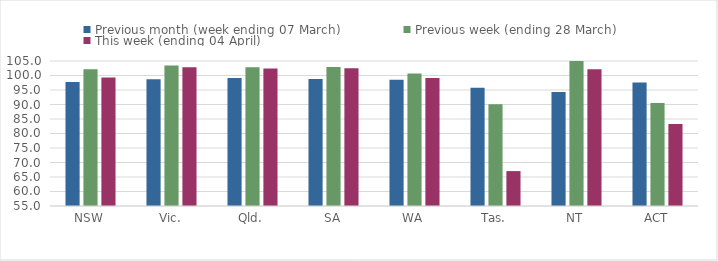
| Category | Previous month (week ending 07 March) | Previous week (ending 28 March) | This week (ending 04 April) |
|---|---|---|---|
| NSW | 97.787 | 102.174 | 99.277 |
| Vic. | 98.672 | 103.405 | 102.804 |
| Qld. | 99.154 | 102.83 | 102.428 |
| SA | 98.753 | 102.9 | 102.48 |
| WA | 98.575 | 100.71 | 99.131 |
| Tas. | 95.744 | 90.087 | 67.037 |
| NT | 94.308 | 105.575 | 102.171 |
| ACT | 97.544 | 90.529 | 83.297 |